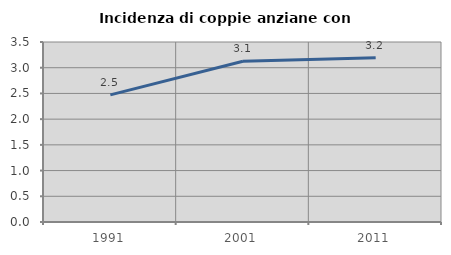
| Category | Incidenza di coppie anziane con figli |
|---|---|
| 1991.0 | 2.473 |
| 2001.0 | 3.125 |
| 2011.0 | 3.195 |